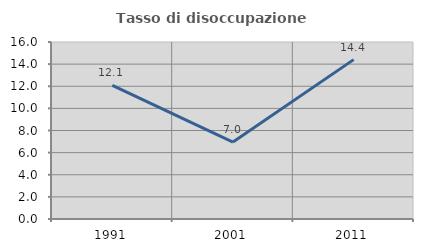
| Category | Tasso di disoccupazione giovanile  |
|---|---|
| 1991.0 | 12.077 |
| 2001.0 | 6.957 |
| 2011.0 | 14.407 |